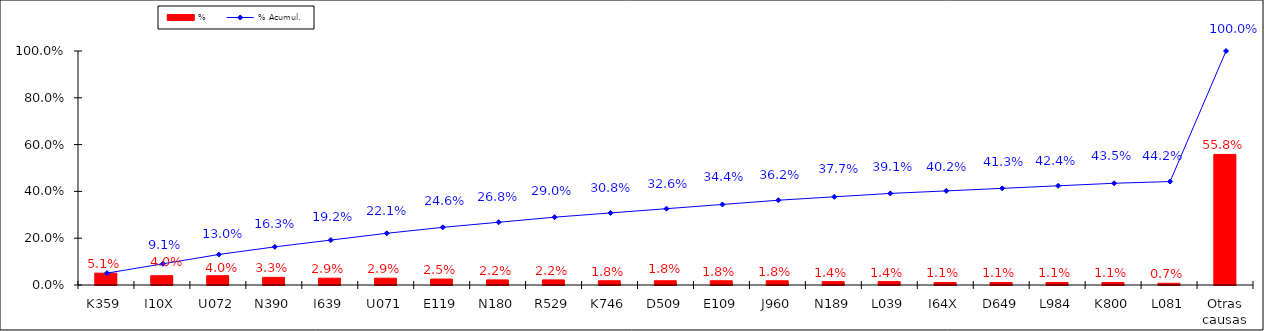
| Category | % |
|---|---|
| K359 | 0.051 |
| I10X | 0.04 |
| U072 | 0.04 |
| N390 | 0.033 |
| I639 | 0.029 |
| U071 | 0.029 |
| E119 | 0.025 |
| N180 | 0.022 |
| R529 | 0.022 |
| K746 | 0.018 |
| D509 | 0.018 |
| E109 | 0.018 |
| J960 | 0.018 |
| N189 | 0.014 |
| L039 | 0.014 |
| I64X | 0.011 |
| D649 | 0.011 |
| L984 | 0.011 |
| K800 | 0.011 |
| L081 | 0.007 |
| Otras causas | 0.558 |